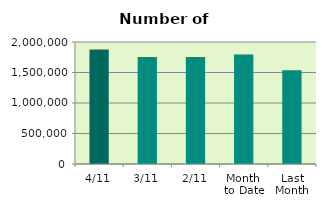
| Category | Series 0 |
|---|---|
| 4/11 | 1876378 |
| 3/11 | 1756064 |
| 2/11 | 1752226 |
| Month 
to Date | 1794889.333 |
| Last
Month | 1538680.909 |